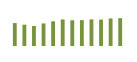
| Category | Saldo [ (1)-(2) ] |
|---|---|
| 0 | 532729.955 |
| 1 | 495602.949 |
| 2 | 464912.543 |
| 3 | 524886.84 |
| 4 | 575003.691 |
| 5 | 617133.535 |
| 6 | 598394.561 |
| 7 | 601130.812 |
| 8 | 618778.996 |
| 9 | 613783.089 |
| 10 | 640835.074 |
| 11 | 647428.889 |